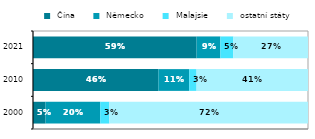
| Category |  Čína |  Německo |  Malajsie |  ostatní státy |
|---|---|---|---|---|
| 2000 | 0.046 | 0.199 | 0.033 | 0.722 |
|  2010 | 0.456 | 0.112 | 0.027 | 0.405 |
| 2021 | 0.595 | 0.086 | 0.047 | 0.271 |